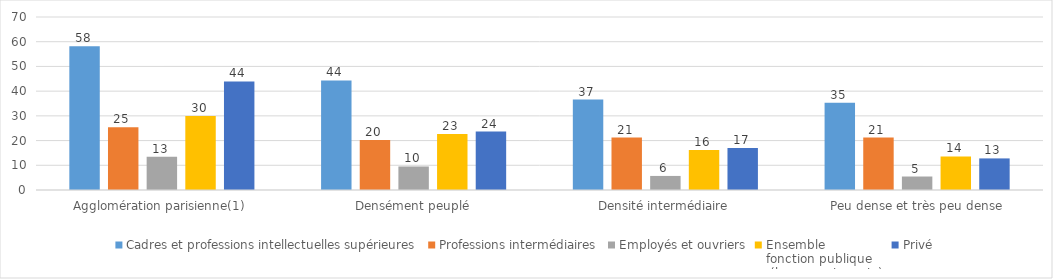
| Category | Cadres et professions intellectuelles supérieures | Professions intermédiaires | Employés et ouvriers | Ensemble 
fonction publique
 (hors enseignants) | Privé |
|---|---|---|---|---|---|
| Agglomération parisienne(1) | 58.17 | 25.42 | 13.41 | 29.91 | 43.92 |
| Densément peuplé | 44.34 | 20.24 | 9.52 | 22.7 | 23.67 |
| Densité intermédiaire | 36.61 | 21.21 | 5.69 | 16.23 | 16.96 |
| Peu dense et très peu dense | 35.35 | 21.21 | 5.46 | 13.58 | 12.78 |